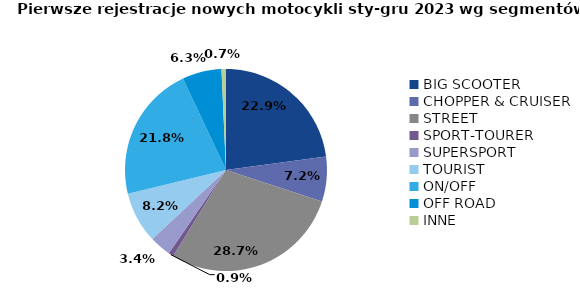
| Category | Series 0 |
|---|---|
| 0 | 6346 |
| 1 | 1996 |
| 2 | 7965 |
| 3 | 232 |
| 4 | 952 |
| 5 | 2282 |
| 6 | 6040 |
| 7 | 1744 |
| 8 | 199 |